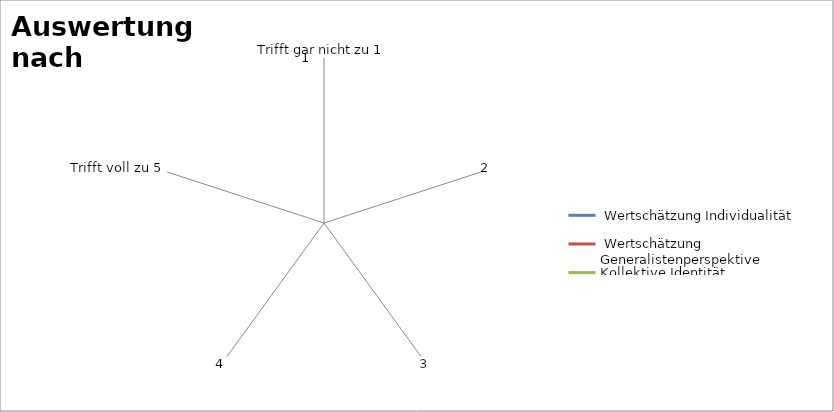
| Category |  Wertschätzung Individualität |  Wertschätzung Generalistenperspektive | Kollektive Identität |
|---|---|---|---|
| Trifft gar nicht zu 1 | 0 | 0 | 0 |
| 2 | 0 | 0 | 0 |
| 3 | 0 | 0 | 0 |
| 4 | 0 | 0 | 0 |
| Trifft voll zu 5 | 0 | 0 | 0 |